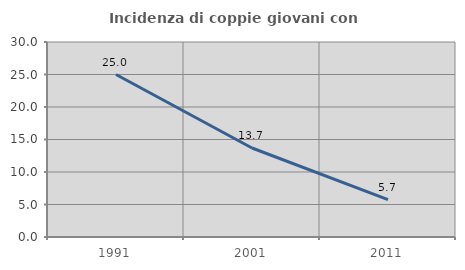
| Category | Incidenza di coppie giovani con figli |
|---|---|
| 1991.0 | 25 |
| 2001.0 | 13.69 |
| 2011.0 | 5.747 |